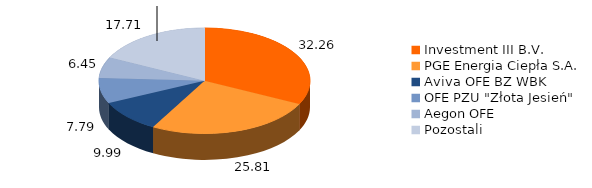
| Category | Series 2 | Series 3 | Series 1 | Series 0 |
|---|---|---|---|---|
| Investment III B.V.  | 32.263 | 0 | 4807132 | 4807132 |
| PGE Energia Ciepła S.A. | 25.806 | 32.263 | 3845041 | 3845041 |
| Aviva OFE BZ WBK | 9.993 | 25.806 | 1489000 | 1489000 |
| OFE PZU "Złota Jesień" | 7.785 | 9.993 | 1160000 | 1160000 |
| Aegon OFE | 6.448 | 7.785 | 960690 | 960690 |
| Pozostali | 17.706 | 6.448 | 2638137 | 2638137 |